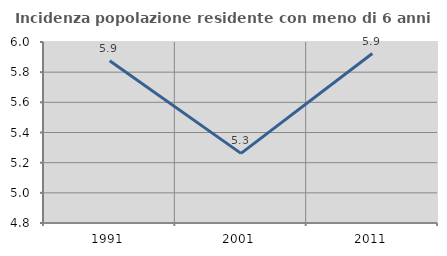
| Category | Incidenza popolazione residente con meno di 6 anni |
|---|---|
| 1991.0 | 5.876 |
| 2001.0 | 5.262 |
| 2011.0 | 5.923 |